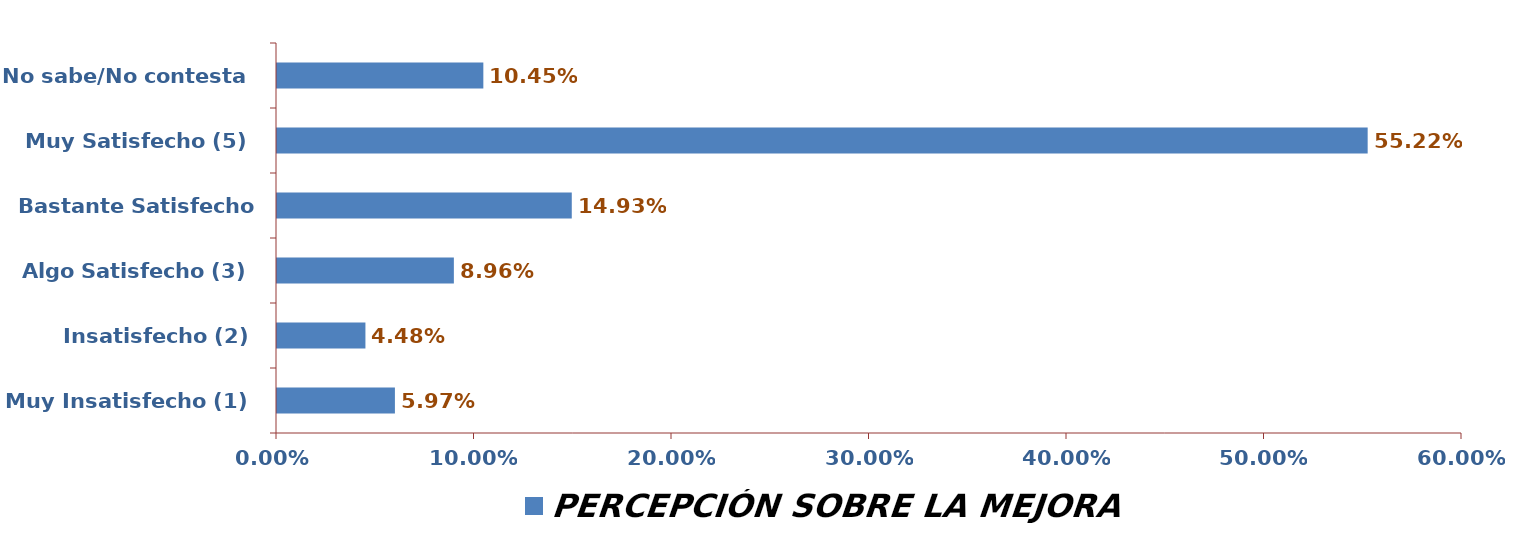
| Category | PERCEPCIÓN SOBRE LA MEJORA |
|---|---|
| Muy Insatisfecho (1) | 0.06 |
| Insatisfecho (2) | 0.045 |
| Algo Satisfecho (3) | 0.09 |
| Bastante Satisfecho (4) | 0.149 |
| Muy Satisfecho (5) | 0.552 |
| No sabe/No contesta | 0.104 |